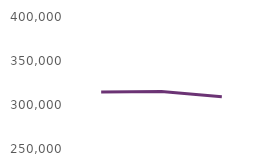
| Category | Users accessing the website |
|---|---|
| Apr23 | 314858 |
| May23 | 315230 |
| Jun23 | 309346 |